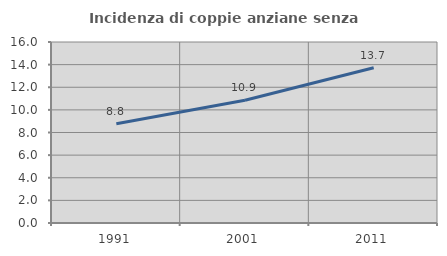
| Category | Incidenza di coppie anziane senza figli  |
|---|---|
| 1991.0 | 8.766 |
| 2001.0 | 10.855 |
| 2011.0 | 13.73 |